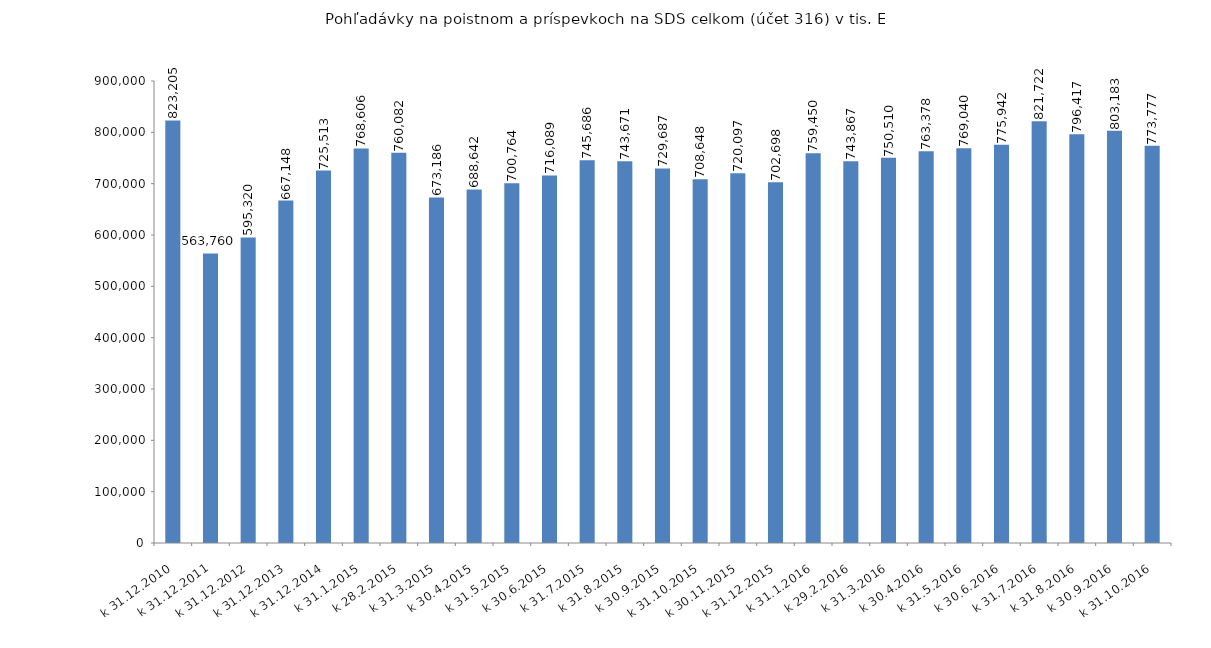
| Category | Series 0 |
|---|---|
| k 31.12.2010 | 823205 |
|  k 31.12.2011 | 563760.215 |
| k 31.12.2012 | 595319.52 |
| k 31.12.2013 | 667147.854 |
| k 31.12.2014 | 725513.4 |
| k 31.1.2015 | 768605.824 |
| k 28.2.2015 | 760081.527 |
| k 31.3.2015 | 673186.485 |
| k 30.4.2015 | 688642.112 |
| k 31.5.2015 | 700764.316 |
| k 30.6.2015 | 716089.075 |
| k 31.7.2015 | 745686.482 |
| k 31.8.2015 | 743671.164 |
| k 30.9.2015 | 729687.497 |
| k 31.10.2015 | 708647.928 |
| k 30.11.2015 | 720096.689 |
| k 31.12.2015 | 702697.806 |
| k 31.1.2016 | 759450.326 |
| k 29.2.2016 | 743867.391 |
| k 31.3.2016 | 750510.428 |
| k 30.4.2016 | 763377.861 |
| k 31.5.2016 | 769039.94 |
| k 30.6.2016 | 775941.766 |
| k 31.7.2016 | 821722.193 |
| k 31.8.2016 | 796417.363 |
| k 30.9.2016 | 803183.197 |
| k 31.10.2016 | 773776.627 |